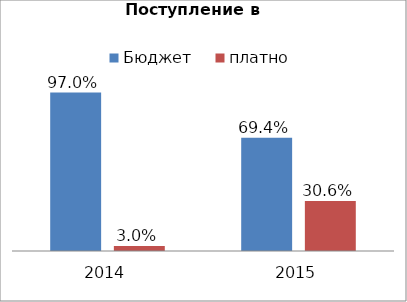
| Category | Бюджет | платно |
|---|---|---|
| 2014.0 | 0.97 | 0.03 |
| 2015.0 | 0.694 | 0.306 |